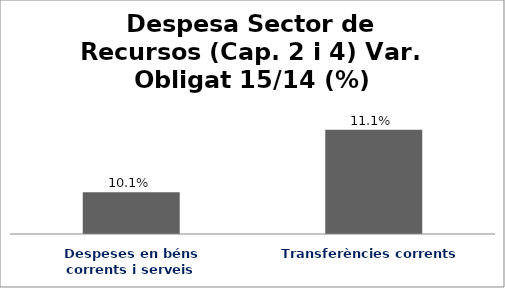
| Category | Series 0 |
|---|---|
| Despeses en béns corrents i serveis | 0.101 |
| Transferències corrents | 0.111 |